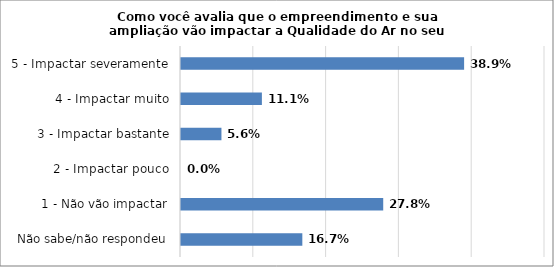
| Category | Series 0 |
|---|---|
| Não sabe/não respondeu | 0.167 |
| 1 - Não vão impactar | 0.278 |
| 2 - Impactar pouco | 0 |
| 3 - Impactar bastante | 0.056 |
| 4 - Impactar muito | 0.111 |
| 5 - Impactar severamente | 0.389 |